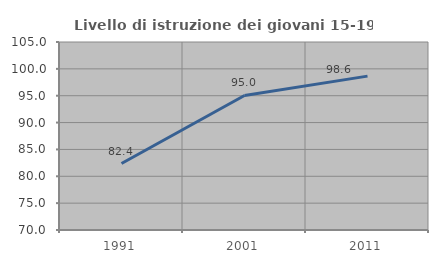
| Category | Livello di istruzione dei giovani 15-19 anni |
|---|---|
| 1991.0 | 82.371 |
| 2001.0 | 95.05 |
| 2011.0 | 98.649 |